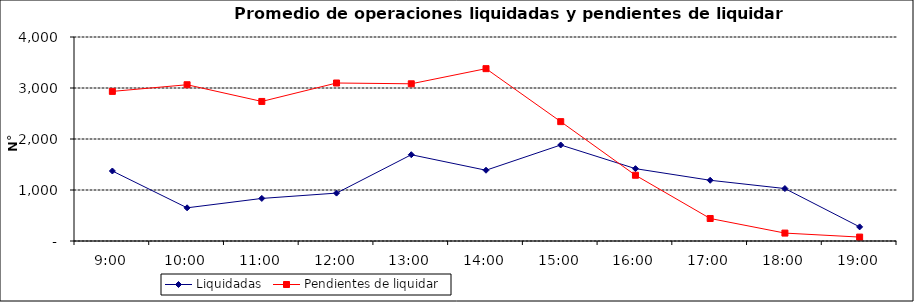
| Category | Liquidadas | Pendientes de liquidar |
|---|---|---|
| 0.375 | 1372.619 | 2933.333 |
| 0.4166666666666667 | 650.714 | 3063.905 |
| 0.4583333333333333 | 834.667 | 2736.381 |
| 0.5 | 939.143 | 3097.952 |
| 0.5416666666666666 | 1691.571 | 3082.429 |
| 0.5833333333333334 | 1387.381 | 3379.333 |
| 0.625 | 1882.381 | 2340.571 |
| 0.6666666666666666 | 1418.238 | 1289 |
| 0.7083333333333334 | 1190.762 | 441.238 |
| 0.75 | 1028.429 | 155.19 |
| 0.7916666666666666 | 276.667 | 76.857 |